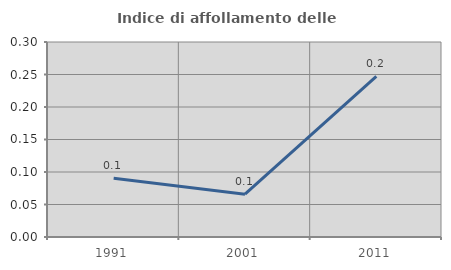
| Category | Indice di affollamento delle abitazioni  |
|---|---|
| 1991.0 | 0.09 |
| 2001.0 | 0.066 |
| 2011.0 | 0.247 |